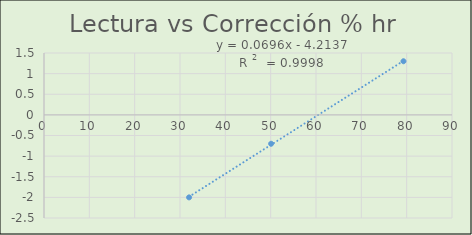
| Category | Series 0 |
|---|---|
| 32.0 | -2 |
| 50.1 | -0.7 |
| 79.3 | 1.3 |